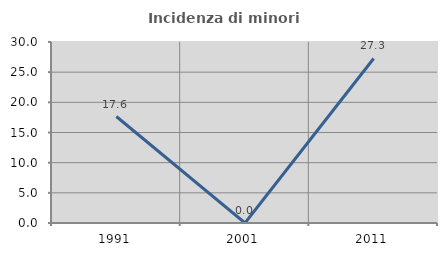
| Category | Incidenza di minori stranieri |
|---|---|
| 1991.0 | 17.647 |
| 2001.0 | 0 |
| 2011.0 | 27.273 |